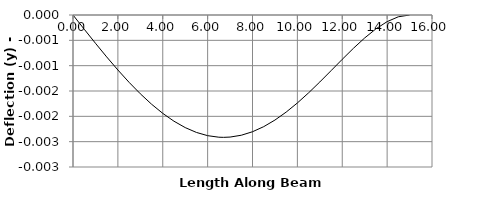
| Category | y |
|---|---|
| 0.0 | 0 |
| 0.0 | 0 |
| 0.5 | 0 |
| 1.0 | -0.001 |
| 1.5 | -0.001 |
| 2.0 | -0.001 |
| 2.0 | -0.001 |
| 2.5 | -0.001 |
| 3.0 | -0.002 |
| 3.5 | -0.002 |
| 4.0 | -0.002 |
| 4.5 | -0.002 |
| 5.0 | -0.002 |
| 5.5 | -0.002 |
| 6.0 | -0.002 |
| 6.5 | -0.002 |
| 6.711 | -0.002 |
| 7.0 | -0.002 |
| 7.5 | -0.002 |
| 8.0 | -0.002 |
| 8.5 | -0.002 |
| 9.0 | -0.002 |
| 9.5 | -0.002 |
| 10.0 | -0.002 |
| 10.5 | -0.002 |
| 11.0 | -0.001 |
| 11.5 | -0.001 |
| 12.0 | -0.001 |
| 12.5 | -0.001 |
| 13.0 | 0 |
| 13.5 | 0 |
| 14.0 | 0 |
| 14.5 | 0 |
| 15.0 | 0 |